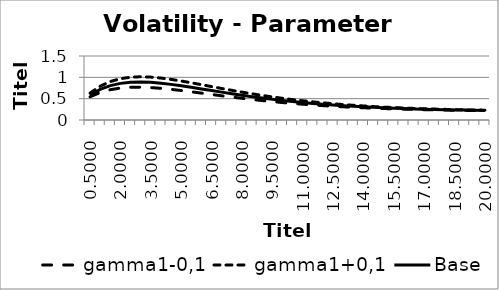
| Category | gamma1-0,1 | gamma1+0,1 | Base |
|---|---|---|---|
| 0.5 | 0.544 | 0.63 | 0.587 |
| 1.0 | 0.644 | 0.793 | 0.719 |
| 1.5 | 0.71 | 0.901 | 0.806 |
| 2.0 | 0.749 | 0.968 | 0.859 |
| 2.5 | 0.767 | 1.003 | 0.885 |
| 3.0 | 0.769 | 1.013 | 0.891 |
| 3.5 | 0.76 | 1.005 | 0.882 |
| 4.0 | 0.742 | 0.983 | 0.863 |
| 4.5 | 0.718 | 0.952 | 0.835 |
| 5.0 | 0.691 | 0.914 | 0.802 |
| 5.5 | 0.661 | 0.872 | 0.767 |
| 6.0 | 0.63 | 0.828 | 0.729 |
| 6.5 | 0.598 | 0.783 | 0.691 |
| 7.0 | 0.567 | 0.739 | 0.653 |
| 7.5 | 0.537 | 0.695 | 0.616 |
| 8.0 | 0.508 | 0.654 | 0.581 |
| 8.5 | 0.481 | 0.614 | 0.547 |
| 9.0 | 0.455 | 0.576 | 0.516 |
| 9.5 | 0.431 | 0.541 | 0.486 |
| 10.0 | 0.409 | 0.509 | 0.459 |
| 10.5 | 0.389 | 0.479 | 0.434 |
| 11.0 | 0.37 | 0.451 | 0.41 |
| 11.5 | 0.352 | 0.425 | 0.389 |
| 12.0 | 0.337 | 0.402 | 0.369 |
| 12.5 | 0.322 | 0.381 | 0.352 |
| 13.0 | 0.309 | 0.362 | 0.336 |
| 13.5 | 0.298 | 0.345 | 0.321 |
| 14.0 | 0.287 | 0.329 | 0.308 |
| 14.5 | 0.277 | 0.315 | 0.296 |
| 15.0 | 0.269 | 0.302 | 0.286 |
| 15.5 | 0.261 | 0.291 | 0.276 |
| 16.0 | 0.254 | 0.281 | 0.267 |
| 16.5 | 0.248 | 0.272 | 0.26 |
| 17.0 | 0.243 | 0.263 | 0.253 |
| 17.5 | 0.238 | 0.256 | 0.247 |
| 18.0 | 0.233 | 0.25 | 0.242 |
| 18.5 | 0.23 | 0.244 | 0.237 |
| 19.0 | 0.226 | 0.239 | 0.232 |
| 19.5 | 0.223 | 0.234 | 0.229 |
| 20.0 | 0.22 | 0.23 | 0.225 |